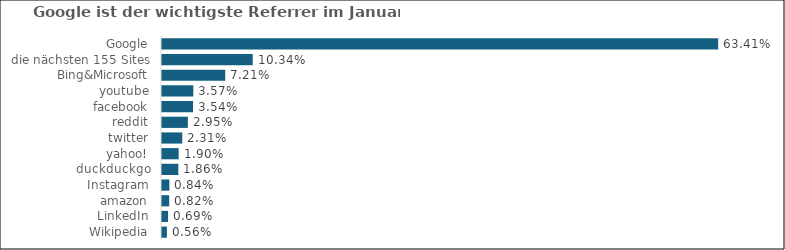
| Category | Anteil |
|---|---|
| Wikipedia | 0.56 |
| LinkedIn | 0.69 |
| amazon | 0.82 |
| Instagram | 0.84 |
| duckduckgo | 1.86 |
| yahoo! | 1.9 |
| twitter | 2.31 |
| reddit | 2.95 |
| facebook | 3.54 |
| youtube | 3.57 |
| Bing&Microsoft | 7.21 |
| die nächsten 155 Sites | 10.34 |
| Google | 63.41 |